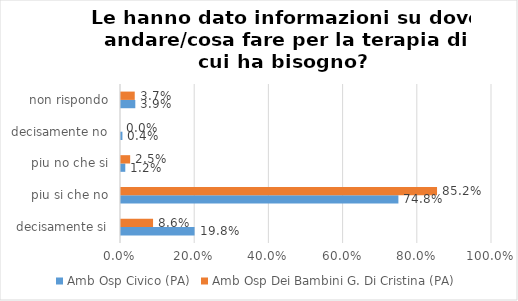
| Category | Amb Osp Civico (PA) | Amb Osp Dei Bambini G. Di Cristina (PA) |
|---|---|---|
| decisamente si | 0.198 | 0.086 |
| piu si che no | 0.748 | 0.852 |
| piu no che si | 0.012 | 0.025 |
| decisamente no | 0.004 | 0 |
| non rispondo | 0.039 | 0.037 |